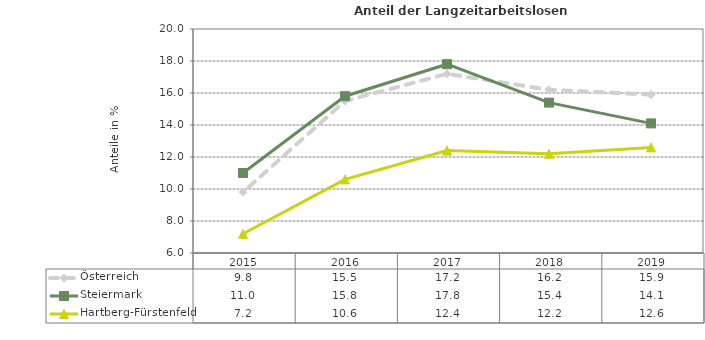
| Category | Österreich | Steiermark | Hartberg-Fürstenfeld |
|---|---|---|---|
| 2019.0 | 15.9 | 14.1 | 12.6 |
| 2018.0 | 16.2 | 15.4 | 12.2 |
| 2017.0 | 17.2 | 17.8 | 12.4 |
| 2016.0 | 15.5 | 15.8 | 10.6 |
| 2015.0 | 9.8 | 11 | 7.2 |